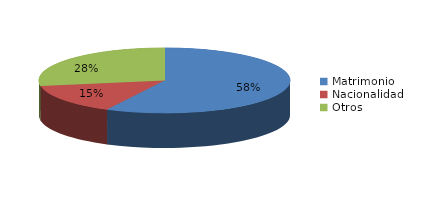
| Category | Series 0 |
|---|---|
| Matrimonio | 1316 |
| Nacionalidad | 338 |
| Otros | 634 |